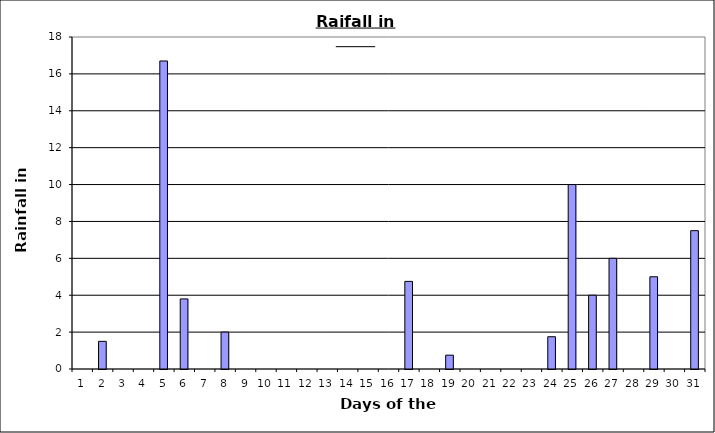
| Category | Series 0 |
|---|---|
| 0 | 0 |
| 1 | 1.5 |
| 2 | 0 |
| 3 | 0 |
| 4 | 16.7 |
| 5 | 3.8 |
| 6 | 0 |
| 7 | 2 |
| 8 | 0 |
| 9 | 0 |
| 10 | 0 |
| 11 | 0 |
| 12 | 0 |
| 13 | 0 |
| 14 | 0 |
| 15 | 0 |
| 16 | 4.75 |
| 17 | 0 |
| 18 | 0.75 |
| 19 | 0 |
| 20 | 0 |
| 21 | 0 |
| 22 | 0 |
| 23 | 1.75 |
| 24 | 10 |
| 25 | 4 |
| 26 | 6 |
| 27 | 0 |
| 28 | 5 |
| 29 | 0 |
| 30 | 7.5 |